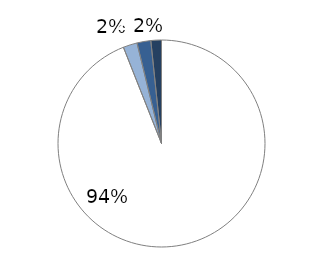
| Category | Residential & Commercial |
|---|---|
| EUR 0   | 0.94 |
| EUR 0-5   | 0.022 |
| EUR 5-30   | 0.022 |
| EUR >30 per tonne of CO2 | 0.017 |